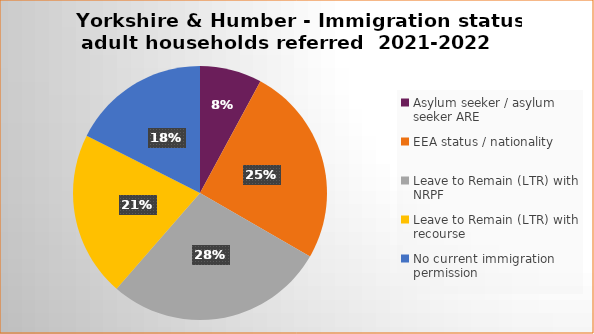
| Category | Number  | Percentage |
|---|---|---|
| Asylum seeker / asylum seeker ARE | 9 | 0.079 |
| EEA status / nationality  | 29 | 0.254 |
| Leave to Remain (LTR) with NRPF | 32 | 0.281 |
| Leave to Remain (LTR) with recourse | 24 | 0.211 |
| No current immigration permission | 20 | 0.175 |